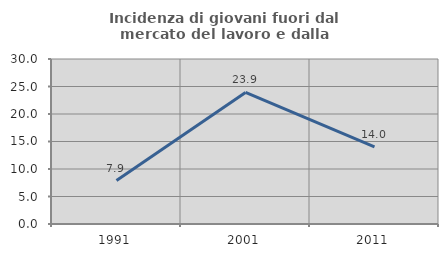
| Category | Incidenza di giovani fuori dal mercato del lavoro e dalla formazione  |
|---|---|
| 1991.0 | 7.904 |
| 2001.0 | 23.929 |
| 2011.0 | 14.027 |